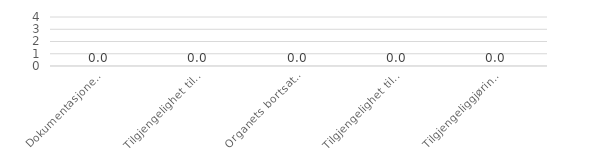
| Category | Series 5 |
|---|---|
| Dokumentasjonen er tilgjengelig/anvendelig  | 0 |
| Tilgjengelighet til dagligarkiv hos organet | 0 |
| Organets bortsatte arkiv er tilgjengelige | 0 |
| Tilgjengelighet til deponert/avlevert arkiv | 0 |
| Tilgjengeliggjøring av analogt arkiv | 0 |